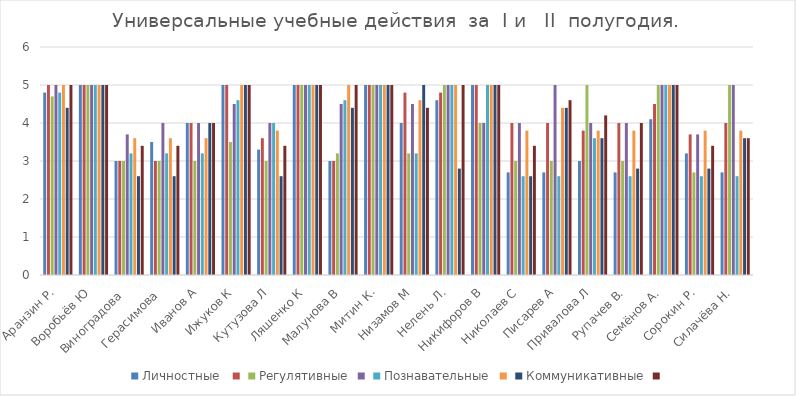
| Category | Личностные  | Series 1 | Регулятивные | Series 3 | Познавательные | Series 5 | Коммуникативные | Series 7 |
|---|---|---|---|---|---|---|---|---|
| Аранзин Р. | 4.8 | 5 | 4.7 | 5 | 4.8 | 5 | 4.4 | 5 |
| Воробьёв Ю | 5 | 5 | 5 | 5 | 5 | 5 | 5 | 5 |
| Виноградова  | 3 | 3 | 3 | 3.7 | 3.2 | 3.6 | 2.6 | 3.4 |
| Герасимова  | 3.5 | 3 | 3 | 4 | 3.2 | 3.6 | 2.6 | 3.4 |
| Иванов А | 4 | 4 | 3 | 4 | 3.2 | 3.6 | 4 | 4 |
| Ижуков К | 5 | 5 | 3.5 | 4.5 | 4.6 | 5 | 5 | 5 |
| Кутузова Л | 3.3 | 3.6 | 3 | 4 | 4 | 3.8 | 2.6 | 3.4 |
| Ляшенко К | 5 | 5 | 5 | 5 | 5 | 5 | 5 | 5 |
| Малунова В | 3 | 3 | 3.2 | 4.5 | 4.6 | 5 | 4.4 | 5 |
| Митин К. | 5 | 5 | 5 | 5 | 5 | 5 | 5 | 5 |
| Низамов М | 4 | 4.8 | 3.2 | 4.5 | 3.2 | 4.6 | 5 | 4.4 |
| Нелень Л. | 4.6 | 4.8 | 5 | 5 | 5 | 5 | 2.8 | 5 |
| Никифоров В | 5 | 5 | 4 | 4 | 5 | 5 | 5 | 5 |
| Николаев С | 2.7 | 4 | 3 | 4 | 2.6 | 3.8 | 2.6 | 3.4 |
| Писарев А | 2.7 | 4 | 3 | 5 | 2.6 | 4.4 | 4.4 | 4.6 |
| Привалова Л | 3 | 3.8 | 5 | 4 | 3.6 | 3.8 | 3.6 | 4.2 |
| Рупачев В. | 2.7 | 4 | 3 | 4 | 2.6 | 3.8 | 2.8 | 4 |
| Семёнов А. | 4.1 | 4.5 | 5 | 5 | 5 | 5 | 5 | 5 |
| Сорокин Р. | 3.2 | 3.7 | 2.7 | 3.7 | 2.6 | 3.8 | 2.8 | 3.4 |
| Силачёва Н. | 2.7 | 4 | 5 | 5 | 2.6 | 3.8 | 3.6 | 3.6 |